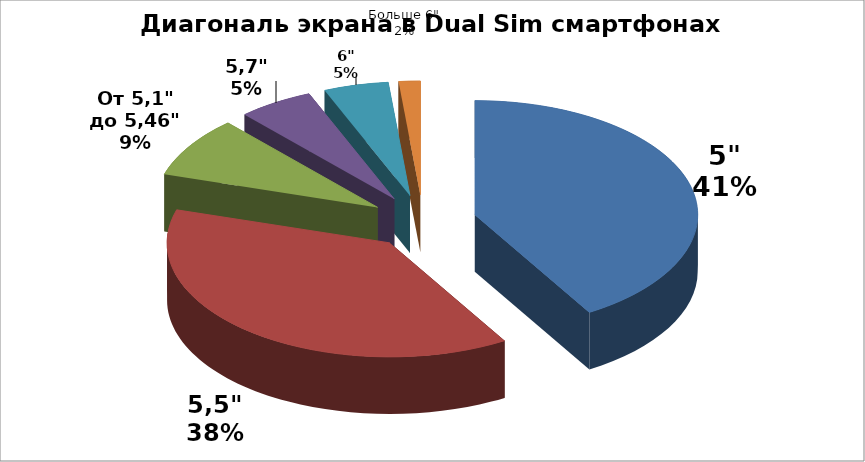
| Category | Series 0 |
|---|---|
| 5" | 53 |
| 5,5" | 49 |
| От 5,1" до 5,46" | 11 |
| 5,7" | 7 |
| 6" | 6 |
| Больше 6" | 2 |